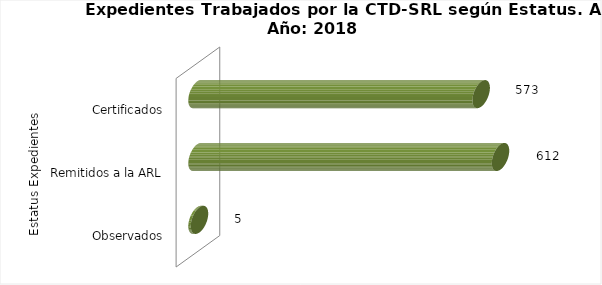
| Category | Total |
|---|---|
| 0 | 5 |
| 1 | 612 |
| 2 | 573 |